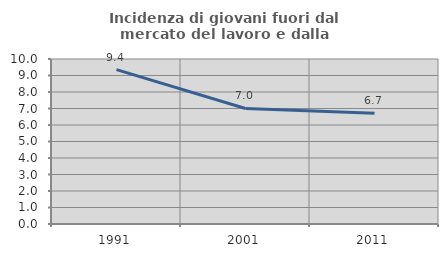
| Category | Incidenza di giovani fuori dal mercato del lavoro e dalla formazione  |
|---|---|
| 1991.0 | 9.359 |
| 2001.0 | 7.002 |
| 2011.0 | 6.719 |